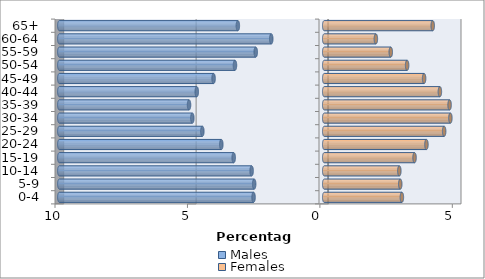
| Category | Males | Females |
|---|---|---|
| 0-4 | -2.668 | 2.932 |
| 5-9 | -2.644 | 2.87 |
| 10-14 | -2.741 | 2.836 |
| 15-19 | -3.418 | 3.41 |
| 20-24 | -3.885 | 3.859 |
| 25-29 | -4.601 | 4.528 |
| 30-34 | -4.979 | 4.763 |
| 35-39 | -5.104 | 4.733 |
| 40-44 | -4.811 | 4.366 |
| 45-49 | -4.177 | 3.771 |
| 50-54 | -3.37 | 3.129 |
| 55-59 | -2.585 | 2.512 |
| 60-64 | -2 | 1.95 |
| 65+ | -3.261 | 4.096 |